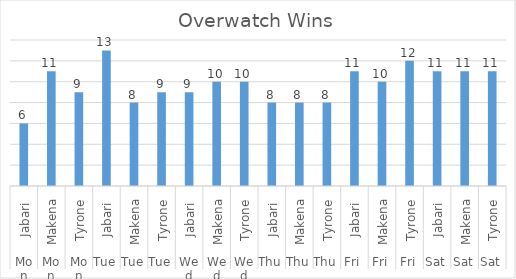
| Category | Wins |
|---|---|
| 0 | 6 |
| 1 | 11 |
| 2 | 9 |
| 3 | 13 |
| 4 | 8 |
| 5 | 9 |
| 6 | 9 |
| 7 | 10 |
| 8 | 10 |
| 9 | 8 |
| 10 | 8 |
| 11 | 8 |
| 12 | 11 |
| 13 | 10 |
| 14 | 12 |
| 15 | 11 |
| 16 | 11 |
| 17 | 11 |